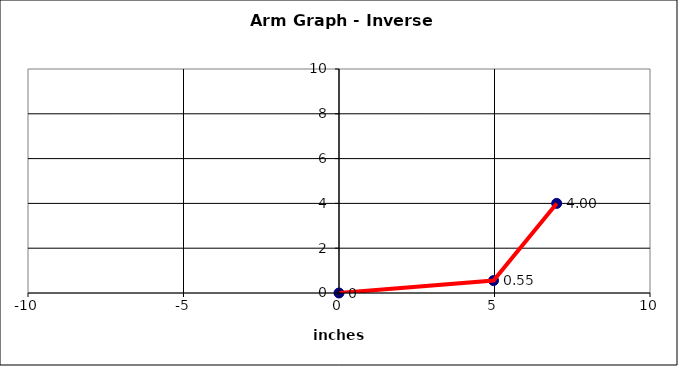
| Category | Series 0 |
|---|---|
| 0.0 | 0 |
| 4.969230769230769 | 0.554 |
| 7.0 | 4 |